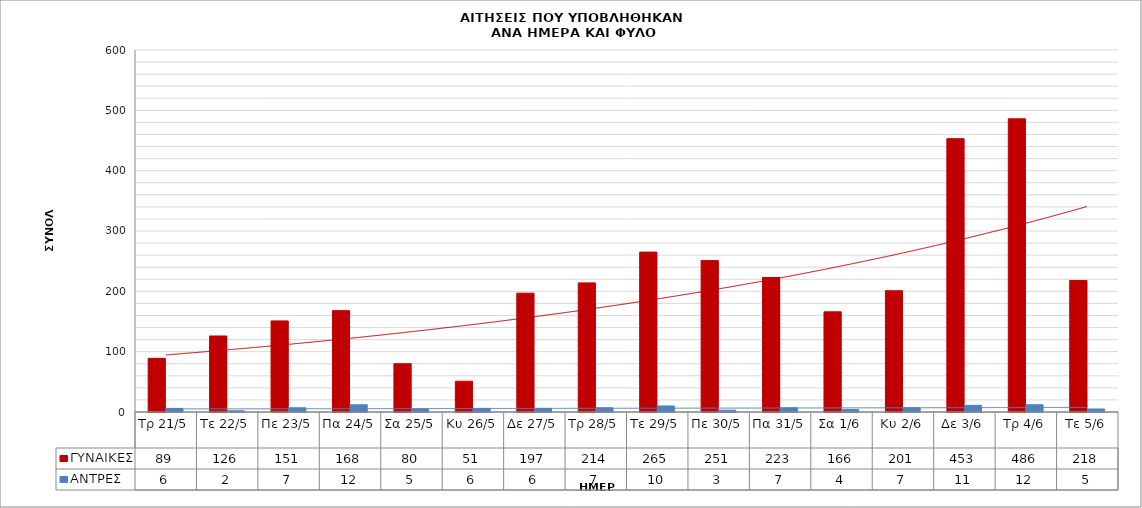
| Category | ΓΥΝΑΙΚΕΣ | ΑΝΤΡΕΣ |
|---|---|---|
| Τρ 21/5 | 89 | 6 |
| Τε 22/5 | 126 | 2 |
| Πε 23/5 | 151 | 7 |
| Πα 24/5 | 168 | 12 |
| Σα 25/5 | 80 | 5 |
| Κυ 26/5 | 51 | 6 |
| Δε 27/5 | 197 | 6 |
| Τρ 28/5 | 214 | 7 |
| Τε 29/5 | 265 | 10 |
| Πε 30/5 | 251 | 3 |
| Πα 31/5 | 223 | 7 |
| Σα 1/6 | 166 | 4 |
| Κυ 2/6 | 201 | 7 |
| Δε 3/6 | 453 | 11 |
| Τρ 4/6 | 486 | 12 |
| Τε 5/6 | 218 | 5 |